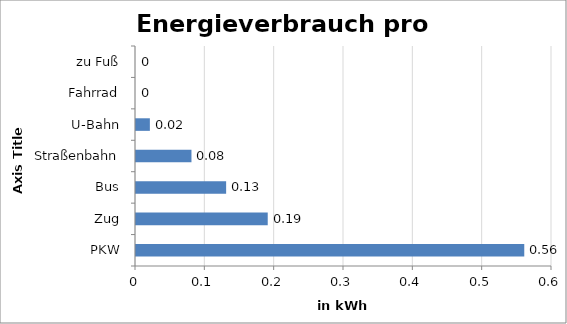
| Category | kWh |
|---|---|
| PKW | 0.56 |
| Zug | 0.19 |
| Bus | 0.13 |
| Straßenbahn | 0.08 |
| U-Bahn | 0.02 |
| Fahrrad | 0 |
| zu Fuß | 0 |